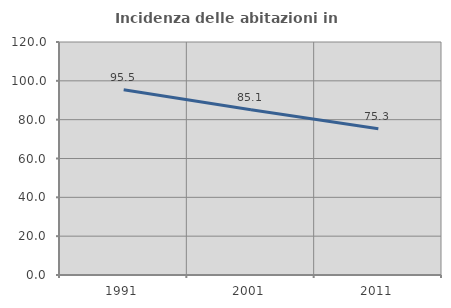
| Category | Incidenza delle abitazioni in proprietà  |
|---|---|
| 1991.0 | 95.455 |
| 2001.0 | 85.075 |
| 2011.0 | 75.333 |